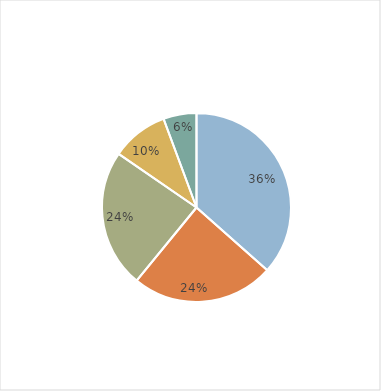
| Category | Series 0 | Data C |
|---|---|---|
| 0 | 71.43 | 0 |
| 1 | 47.618 | 0 |
| 2 | 46.29 | 0 |
| 3 | 19.039 | 0 |
| 4 | 11.067 | 0 |